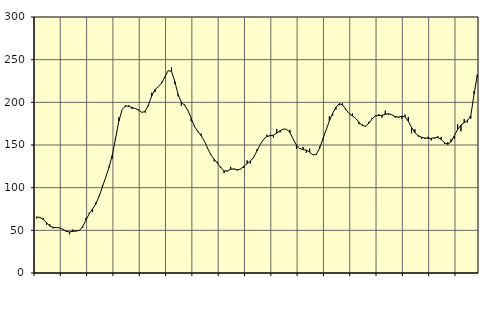
| Category | Piggar | Series 1 |
|---|---|---|
| nan | 63.9 | 65.74 |
| 87.0 | 65.5 | 65.05 |
| 87.0 | 64.5 | 62.82 |
| 87.0 | 56.3 | 58.82 |
| nan | 57.1 | 55.05 |
| 88.0 | 52.3 | 53.47 |
| 88.0 | 53.4 | 53.23 |
| 88.0 | 52.8 | 52.88 |
| nan | 51.4 | 51.08 |
| 89.0 | 49.6 | 48.73 |
| 89.0 | 45.3 | 48.09 |
| 89.0 | 50.9 | 48.81 |
| nan | 48.7 | 49.19 |
| 90.0 | 49.6 | 49.9 |
| 90.0 | 53.1 | 54.28 |
| 90.0 | 64.5 | 62.09 |
| nan | 70.6 | 69.43 |
| 91.0 | 71.4 | 75.02 |
| 91.0 | 82.5 | 81.06 |
| 91.0 | 89.3 | 89.84 |
| nan | 102.8 | 100.93 |
| 92.0 | 112 | 112.19 |
| 92.0 | 125.1 | 123.67 |
| 92.0 | 134.2 | 138.2 |
| nan | 156.2 | 157.85 |
| 93.0 | 182.2 | 178.07 |
| 93.0 | 191.6 | 191.6 |
| 93.0 | 194.9 | 196 |
| nan | 196.7 | 195.24 |
| 94.0 | 192.3 | 193.87 |
| 94.0 | 192.5 | 192.81 |
| 94.0 | 191.9 | 190.87 |
| nan | 188 | 188.2 |
| 95.0 | 187.9 | 189.4 |
| 95.0 | 195.5 | 197.18 |
| 95.0 | 211.3 | 207.61 |
| nan | 212 | 214.95 |
| 96.0 | 218.3 | 218.42 |
| 96.0 | 224 | 222.52 |
| 96.0 | 229 | 229.96 |
| nan | 237.1 | 237.13 |
| 97.0 | 240.9 | 236.27 |
| 97.0 | 221.5 | 224.5 |
| 97.0 | 207.1 | 209.27 |
| nan | 196.1 | 200.23 |
| 98.0 | 197.5 | 196.33 |
| 98.0 | 190.2 | 190.55 |
| 98.0 | 177.6 | 181.19 |
| nan | 172.7 | 171.66 |
| 99.0 | 165 | 165.94 |
| 99.0 | 163.3 | 161.05 |
| 99.0 | 154.5 | 154.5 |
| nan | 145.5 | 145.99 |
| 0.0 | 138.7 | 138.29 |
| 0.0 | 130.8 | 133.11 |
| 0.0 | 130.4 | 128.6 |
| nan | 124.4 | 123.46 |
| 1.0 | 117 | 119.69 |
| 1.0 | 118.7 | 119.64 |
| 1.0 | 124.4 | 121.61 |
| nan | 121.5 | 122.06 |
| 2.0 | 120.1 | 120.9 |
| 2.0 | 122 | 121.75 |
| 2.0 | 123.1 | 124.96 |
| nan | 131.9 | 128.14 |
| 3.0 | 128.2 | 131.12 |
| 3.0 | 135 | 135.76 |
| 3.0 | 144.9 | 143.04 |
| nan | 150.6 | 150.64 |
| 4.0 | 156.4 | 156.62 |
| 4.0 | 162 | 160.02 |
| 4.0 | 162 | 160.73 |
| nan | 158.8 | 161.53 |
| 5.0 | 168.8 | 163.83 |
| 5.0 | 164.8 | 166.68 |
| 5.0 | 168.2 | 168.62 |
| nan | 168.5 | 168.52 |
| 6.0 | 167.8 | 164.63 |
| 6.0 | 157.1 | 156.9 |
| 6.0 | 145.4 | 149.75 |
| nan | 146.2 | 145.93 |
| 7.0 | 147.6 | 144.56 |
| 7.0 | 141 | 143.98 |
| 7.0 | 145.8 | 141.58 |
| nan | 138.2 | 138.4 |
| 8.0 | 138.4 | 138.95 |
| 8.0 | 148.1 | 145.74 |
| 8.0 | 157.5 | 156.68 |
| nan | 167.3 | 167.51 |
| 9.0 | 183.5 | 178.18 |
| 9.0 | 184.5 | 187.23 |
| 9.0 | 191.5 | 194.29 |
| nan | 196.6 | 198.36 |
| 10.0 | 198.7 | 197.21 |
| 10.0 | 191.1 | 191.87 |
| 10.0 | 186.8 | 186.89 |
| nan | 186.9 | 184.09 |
| 11.0 | 181.3 | 181.13 |
| 11.0 | 174.4 | 176.72 |
| 11.0 | 174 | 172.82 |
| nan | 171.2 | 172.14 |
| 12.0 | 177.1 | 175.45 |
| 12.0 | 181.7 | 180.63 |
| 12.0 | 185 | 184.01 |
| nan | 186.1 | 184.57 |
| 13.0 | 182.1 | 184.83 |
| 13.0 | 190.2 | 186.01 |
| 13.0 | 185.3 | 186.65 |
| nan | 185.3 | 185.39 |
| 14.0 | 182.1 | 183.34 |
| 14.0 | 181.6 | 182.71 |
| 14.0 | 180.7 | 183.77 |
| nan | 185.5 | 182.97 |
| 15.0 | 182.9 | 177.95 |
| 15.0 | 163.8 | 170.59 |
| 15.0 | 168.4 | 164.52 |
| nan | 160 | 161 |
| 16.0 | 157.3 | 159.16 |
| 16.0 | 157.2 | 158.22 |
| 16.0 | 159.7 | 157.8 |
| nan | 155.3 | 157.74 |
| 17.0 | 157.7 | 158.43 |
| 17.0 | 160.3 | 158.79 |
| 17.0 | 159.4 | 156.54 |
| nan | 151.6 | 152.66 |
| 18.0 | 153.2 | 150.79 |
| 18.0 | 156.8 | 153.78 |
| 18.0 | 157.1 | 160.85 |
| nan | 174.2 | 168.15 |
| 19.0 | 166.1 | 173.49 |
| 19.0 | 180.4 | 176.04 |
| 19.0 | 176.4 | 178.79 |
| nan | 180.9 | 184.29 |
| 20.0 | 213.2 | 209.65 |
| 20.0 | 229.3 | 232.38 |